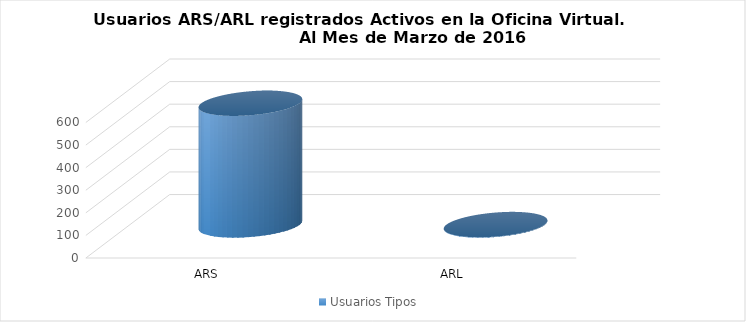
| Category | Usuarios Tipos |
|---|---|
| ARS | 539 |
| ARL | 2 |